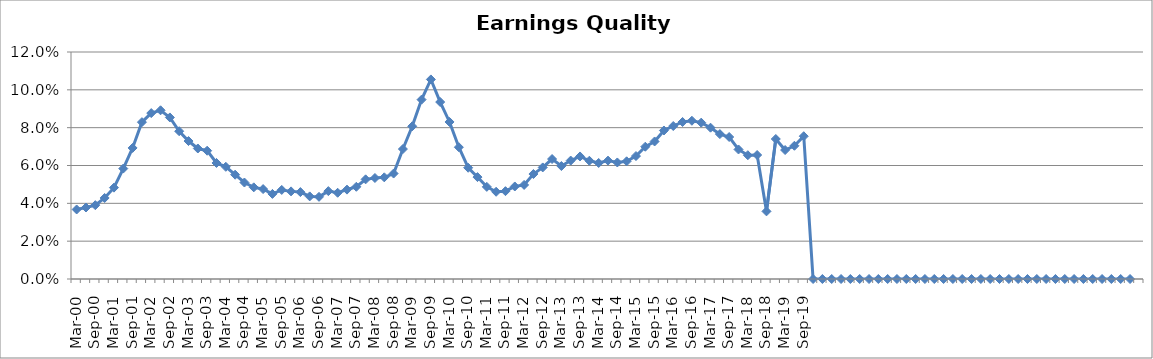
| Category | Rptd. Earnings Quality Indicator |
|---|---|
| Mar-00 | 0.037 |
| Jun-00 | 0.038 |
| Sep-00 | 0.039 |
| Dec-00 | 0.043 |
| Mar-01 | 0.048 |
| Jun-01 | 0.058 |
| Sep-01 | 0.069 |
| Dec-01 | 0.083 |
| Mar-02 | 0.088 |
| Jun-02 | 0.089 |
| Sep-02 | 0.085 |
| Dec-02 | 0.078 |
| Mar-03 | 0.073 |
| Jun-03 | 0.069 |
| Sep-03 | 0.068 |
| Dec-03 | 0.061 |
| Mar-04 | 0.059 |
| Jun-04 | 0.055 |
| Sep-04 | 0.051 |
| Dec-04 | 0.048 |
| Mar-05 | 0.048 |
| Jun-05 | 0.045 |
| Sep-05 | 0.047 |
| Dec-05 | 0.046 |
| Mar-06 | 0.046 |
| Jun-06 | 0.044 |
| Sep-06 | 0.043 |
| Dec-06 | 0.046 |
| Mar-07 | 0.046 |
| Jun-07 | 0.047 |
| Sep-07 | 0.049 |
| Dec-07 | 0.053 |
| Mar-08 | 0.053 |
| Jun-08 | 0.054 |
| Sep-08 | 0.056 |
| Dec-08 | 0.069 |
| Mar-09 | 0.081 |
| Jun-09 | 0.095 |
| Sep-09 | 0.105 |
| Dec-09 | 0.094 |
| Mar-10 | 0.083 |
| Jun-10 | 0.07 |
| Sep-10 | 0.059 |
| Dec-10 | 0.054 |
| Mar-11 | 0.049 |
| Jun-11 | 0.046 |
| Sep-11 | 0.046 |
| Dec-11 | 0.049 |
| Mar-12 | 0.05 |
| Jun-12 | 0.055 |
| Sep-12 | 0.059 |
| Dec-12 | 0.063 |
| Mar-13 | 0.06 |
| Jun-13 | 0.063 |
| Sep-13 | 0.065 |
| Dec-13 | 0.063 |
| Mar-14 | 0.061 |
| Jun-14 | 0.063 |
| Sep-14 | 0.062 |
| Dec-14 | 0.062 |
| Mar-15 | 0.065 |
| Jun-15 | 0.07 |
| Sep-15 | 0.073 |
| Dec-15 | 0.079 |
| Mar-16 | 0.081 |
| Jun-16 | 0.083 |
| Sep-16 | 0.084 |
| Dec-16 | 0.083 |
| Mar-17 | 0.08 |
| Jun-17 | 0.077 |
| Sep-17 | 0.075 |
| Dec-17 | 0.068 |
| Mar-18 | 0.065 |
| Jun-18 | 0.066 |
| Sep-18 | 0.036 |
| Dec-18 | 0.074 |
| Mar-19 | 0.068 |
| Jun-19 | 0.07 |
| Sep-19 | 0.075 |